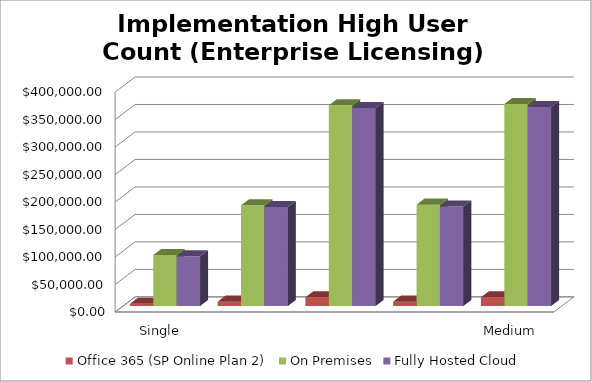
| Category | Office 365 (SP Online Plan 2) | On Premises | Fully Hosted Cloud |
|---|---|---|---|
| Single Server Install (WFE and SQL on 1 VM) | 4000 | 92946.269 | 90670 |
| Small Farm - Two Server Install (WFE and SQL) | 8000 | 183334.608 | 180160 |
| Small Farm w/ High Availability (2 WFE - 2 SQL) | 16000 | 365152.043 | 360325 |
| Medium Farm (1 WFE, 1 App/Index, 1 SQL) | 8000 | 184407.455 | 180860 |
| Medium Farm w/ High Availability (2 WFE, 2 A/I, 2 SQL) | 16000 | 367371.894 | 361915 |